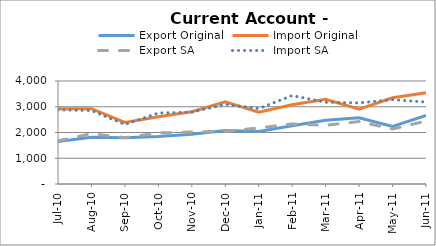
| Category | Export Original | Import Original | Export SA | Import SA |
|---|---|---|---|---|
| 2010-07-31 | 1654 | 2920 | 1678 | 2879 |
| 2010-08-31 | 1819 | 2925 | 1953 | 2854 |
| 2010-09-30 | 1796 | 2392 | 1800 | 2312 |
| 2010-10-31 | 1841 | 2613 | 1983 | 2755 |
| 2010-11-30 | 1935 | 2805 | 2020 | 2791 |
| 2010-12-31 | 2076 | 3191 | 2050 | 3092 |
| 2011-01-31 | 2039 | 2791 | 2175 | 2929 |
| 2011-02-28 | 2260 | 3074 | 2335 | 3433 |
| 2011-03-31 | 2477 | 3288 | 2278 | 3175 |
| 2011-04-30 | 2571 | 2904 | 2426 | 3149 |
| 2011-05-31 | 2239 | 3350 | 2135 | 3275 |
| 2011-06-30 | 2662 | 3543 | 2445 | 3181 |